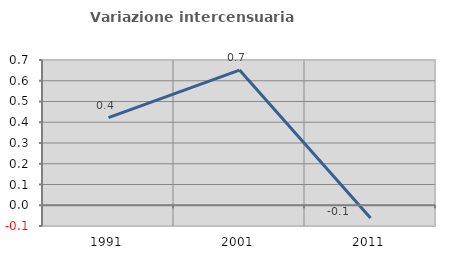
| Category | Variazione intercensuaria annua |
|---|---|
| 1991.0 | 0.422 |
| 2001.0 | 0.651 |
| 2011.0 | -0.062 |